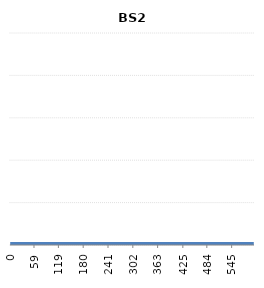
| Category | BS2 |
|---|---|
| 0.0 | 0 |
| 573.0 | 0 |
| 573.0 | 0 |
| 599.0 | 0 |
| 599.0 | 0 |